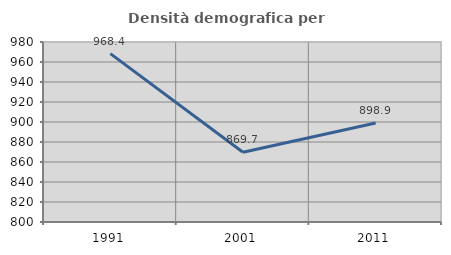
| Category | Densità demografica |
|---|---|
| 1991.0 | 968.385 |
| 2001.0 | 869.684 |
| 2011.0 | 898.94 |